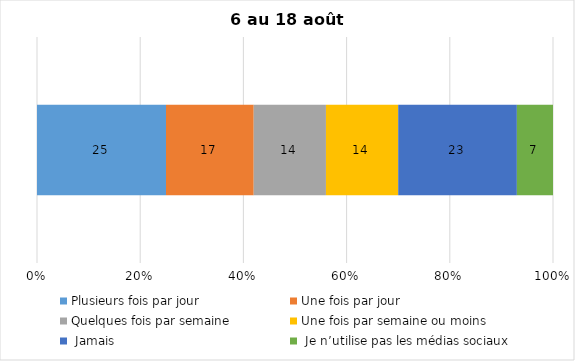
| Category | Plusieurs fois par jour | Une fois par jour | Quelques fois par semaine   | Une fois par semaine ou moins   |  Jamais   |  Je n’utilise pas les médias sociaux |
|---|---|---|---|---|---|---|
| 0 | 25 | 17 | 14 | 14 | 23 | 7 |